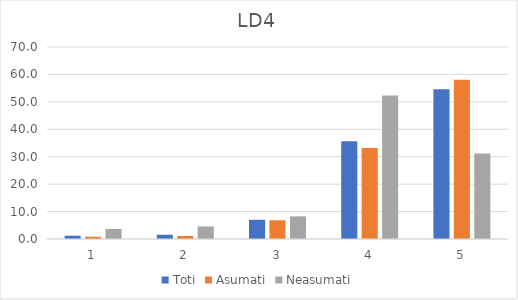
| Category | Toti | Asumati | Neasumati |
|---|---|---|---|
| 0 | 1.189 | 0.82 | 3.67 |
| 1 | 1.546 | 1.093 | 4.587 |
| 2 | 7.015 | 6.831 | 8.257 |
| 3 | 35.672 | 33.197 | 52.294 |
| 4 | 54.578 | 58.06 | 31.193 |